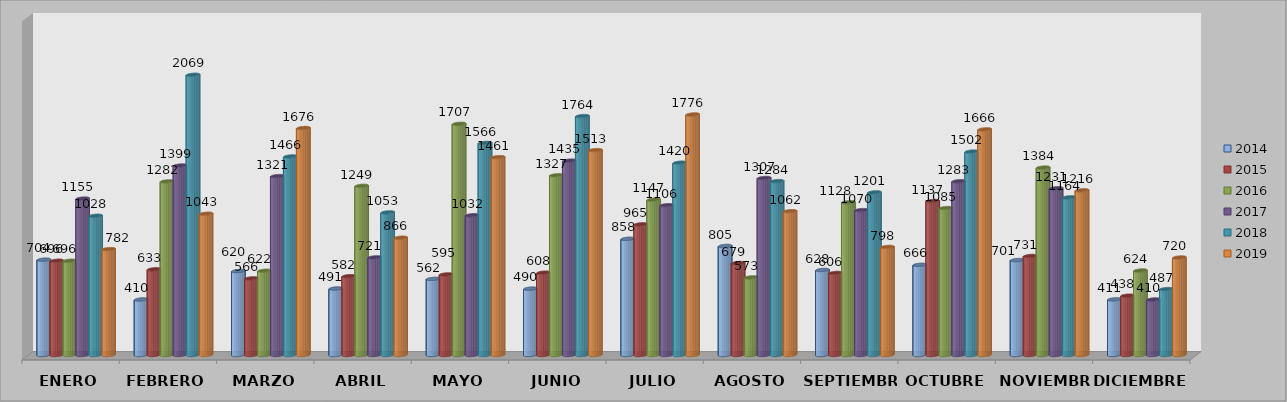
| Category | 2014 | 2015 | 2016 | 2017 | 2018 | 2019 |
|---|---|---|---|---|---|---|
| ENERO | 704 | 696 | 696 | 1155 | 1028 | 782 |
| FEBRERO | 410 | 633 | 1282 | 1399 | 2069 | 1043 |
| MARZO | 620 | 566 | 622 | 1321 | 1466 | 1676 |
| ABRIL | 491 | 582 | 1249 | 721 | 1053 | 866 |
| MAYO | 562 | 595 | 1707 | 1032 | 1566 | 1461 |
| JUNIO | 490 | 608 | 1327 | 1435 | 1764 | 1513 |
| JULIO | 858 | 965 | 1147 | 1106 | 1420 | 1776 |
| AGOSTO | 805 | 679 | 573 | 1307 | 1284 | 1062 |
| SEPTIEMBRE | 628 | 606 | 1128 | 1070 | 1201 | 798 |
| OCTUBRE | 666 | 1137 | 1085 | 1283 | 1502 | 1666 |
| NOVIEMBRE | 701 | 731 | 1384 | 1231 | 1164 | 1216 |
| DICIEMBRE | 411 | 438 | 624 | 410 | 487 | 720 |